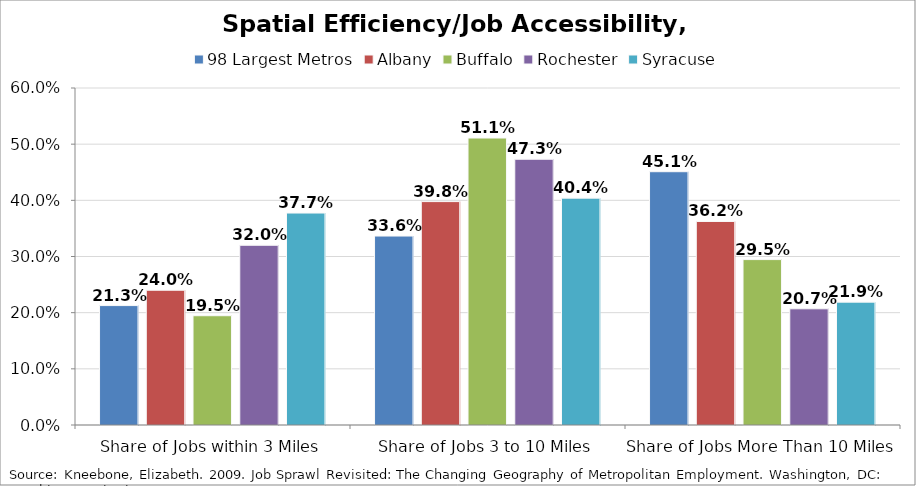
| Category | 98 Largest Metros | Albany | Buffalo | Rochester | Syracuse |
|---|---|---|---|---|---|
| Share of Jobs within 3 Miles | 0.213 | 0.24 | 0.195 | 0.32 | 0.377 |
| Share of Jobs 3 to 10 Miles | 0.336 | 0.398 | 0.511 | 0.473 | 0.404 |
| Share of Jobs More Than 10 Miles | 0.451 | 0.362 | 0.295 | 0.207 | 0.219 |